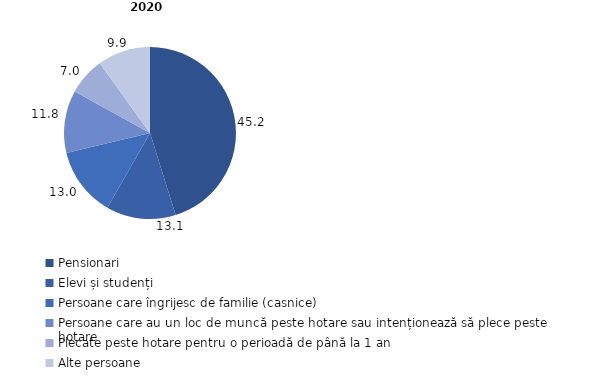
| Category | 2020 |
|---|---|
| Pensionari | 45.199 |
| Elevi și studenți | 13.1 |
| Persoane care îngrijesc de familie (casnice) | 13 |
| Persoane care au un loc de muncă peste hotare sau intenționează să plece peste hotare | 11.774 |
| Plecate peste hotare pentru o perioadă de până la 1 an | 7.043 |
| Alte persoane | 9.937 |